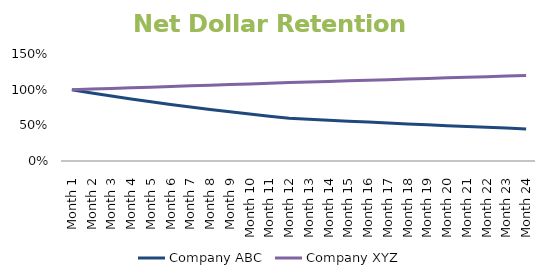
| Category | Company ABC | Company XYZ |
|---|---|---|
| 1.0 | 1 | 1 |
| 2.0 | 0.955 | 1.009 |
| 3.0 | 0.911 | 1.017 |
| 4.0 | 0.87 | 1.026 |
| 5.0 | 0.83 | 1.035 |
| 6.0 | 0.793 | 1.044 |
| 7.0 | 0.757 | 1.053 |
| 8.0 | 0.722 | 1.063 |
| 9.0 | 0.69 | 1.072 |
| 10.0 | 0.658 | 1.081 |
| 11.0 | 0.629 | 1.091 |
| 12.0 | 0.6 | 1.1 |
| 13.0 | 0.586 | 1.108 |
| 14.0 | 0.572 | 1.116 |
| 15.0 | 0.558 | 1.124 |
| 16.0 | 0.545 | 1.132 |
| 17.0 | 0.532 | 1.141 |
| 18.0 | 0.52 | 1.149 |
| 19.0 | 0.507 | 1.157 |
| 20.0 | 0.495 | 1.166 |
| 21.0 | 0.484 | 1.174 |
| 22.0 | 0.472 | 1.183 |
| 23.0 | 0.461 | 1.191 |
| 24.0 | 0.45 | 1.2 |